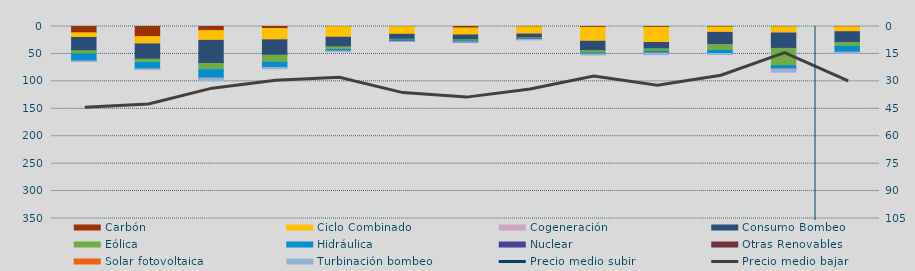
| Category | Carbón | Ciclo Combinado | Cogeneración | Consumo Bombeo | Eólica | Hidráulica | Nuclear | Otras Renovables | Solar fotovoltaica | Turbinación bombeo |
|---|---|---|---|---|---|---|---|---|---|---|
| E | 11468 | 8546.1 | 24.8 | 24157.8 | 5990.6 | 12234.2 | 0 | 55 | 0 | 1264.7 |
| F | 18455.5 | 13295.6 | 2.4 | 27803.3 | 6004.9 | 11413.9 | 0 | 5.4 | 0 | 1349.1 |
| M | 7438 | 17871.7 | 7 | 42074.9 | 11356 | 14642.1 | 0 | 139.1 | 0 | 4992 |
| A | 3690.3 | 20633.5 | 19.2 | 27916.2 | 12958.7 | 9108.9 | 0 | 103.2 | 0 | 2727.4 |
| M | 361.5 | 19230.2 | 80.6 | 17332.6 | 4925.2 | 2441.8 | 0 | 127.2 | 0 | 1259.2 |
| J | 346.1 | 13888.5 | 0 | 8869 | 1186.7 | 2488.5 | 187.1 | 15.9 | 0 | 184.3 |
| J | 2658.9 | 12785.9 | 0 | 8749.3 | 1887.5 | 1893.1 | 0 | 9.8 | 0 | 57.5 |
| A | 567.2 | 13236.4 | 10 | 6766.4 | 1241.9 | 1156.9 | 173 | 38 | 0 | 1232.6 |
| S | 1539.8 | 25452.8 | 8.7 | 16928.4 | 4457.4 | 1540.4 | 0 | 149.5 | 0 | 1916.2 |
| O | 1567.5 | 27564.7 | 0 | 11468.6 | 4269.6 | 3292.2 | 0 | 125.3 | 0 | 3130.6 |
| N | 1032.3 | 9659.8 | 141 | 22022.6 | 10965.1 | 5345.6 | 22.6 | 8.3 | 0 | 1780.7 |
| D | 528.1 | 11341.1 | 86.5 | 27911.2 | 31665.4 | 5608.2 | 0 | 173.7 | 5.9 | 6026.2 |
| E | 543.5 | 9049.8 | 14.2 | 19673 | 6854.8 | 10347.8 | 0 | 7.7 | 0 | 2307.6 |